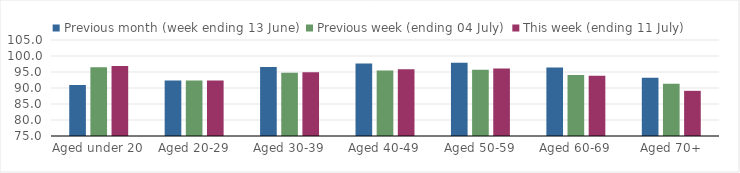
| Category | Previous month (week ending 13 June) | Previous week (ending 04 July) | This week (ending 11 July) |
|---|---|---|---|
| Aged under 20 | 90.963 | 96.498 | 96.893 |
| Aged 20-29 | 92.379 | 92.351 | 92.366 |
| Aged 30-39 | 96.593 | 94.768 | 94.933 |
| Aged 40-49 | 97.643 | 95.501 | 95.881 |
| Aged 50-59 | 97.867 | 95.679 | 96.128 |
| Aged 60-69 | 96.428 | 94.084 | 93.814 |
| Aged 70+ | 93.206 | 91.295 | 89.119 |